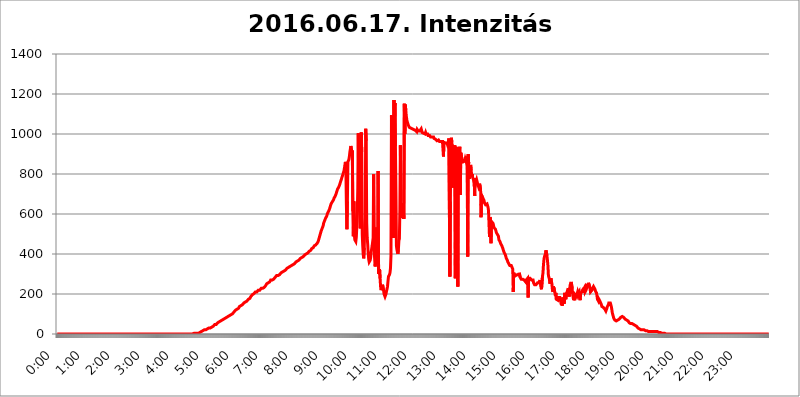
| Category | 2016.06.17. Intenzitás [W/m^2] |
|---|---|
| 0.0 | 0 |
| 0.0006944444444444445 | 0 |
| 0.001388888888888889 | 0 |
| 0.0020833333333333333 | 0 |
| 0.002777777777777778 | 0 |
| 0.003472222222222222 | 0 |
| 0.004166666666666667 | 0 |
| 0.004861111111111111 | 0 |
| 0.005555555555555556 | 0 |
| 0.0062499999999999995 | 0 |
| 0.006944444444444444 | 0 |
| 0.007638888888888889 | 0 |
| 0.008333333333333333 | 0 |
| 0.009027777777777779 | 0 |
| 0.009722222222222222 | 0 |
| 0.010416666666666666 | 0 |
| 0.011111111111111112 | 0 |
| 0.011805555555555555 | 0 |
| 0.012499999999999999 | 0 |
| 0.013194444444444444 | 0 |
| 0.013888888888888888 | 0 |
| 0.014583333333333332 | 0 |
| 0.015277777777777777 | 0 |
| 0.015972222222222224 | 0 |
| 0.016666666666666666 | 0 |
| 0.017361111111111112 | 0 |
| 0.018055555555555557 | 0 |
| 0.01875 | 0 |
| 0.019444444444444445 | 0 |
| 0.02013888888888889 | 0 |
| 0.020833333333333332 | 0 |
| 0.02152777777777778 | 0 |
| 0.022222222222222223 | 0 |
| 0.02291666666666667 | 0 |
| 0.02361111111111111 | 0 |
| 0.024305555555555556 | 0 |
| 0.024999999999999998 | 0 |
| 0.025694444444444447 | 0 |
| 0.02638888888888889 | 0 |
| 0.027083333333333334 | 0 |
| 0.027777777777777776 | 0 |
| 0.02847222222222222 | 0 |
| 0.029166666666666664 | 0 |
| 0.029861111111111113 | 0 |
| 0.030555555555555555 | 0 |
| 0.03125 | 0 |
| 0.03194444444444445 | 0 |
| 0.03263888888888889 | 0 |
| 0.03333333333333333 | 0 |
| 0.034027777777777775 | 0 |
| 0.034722222222222224 | 0 |
| 0.035416666666666666 | 0 |
| 0.036111111111111115 | 0 |
| 0.03680555555555556 | 0 |
| 0.0375 | 0 |
| 0.03819444444444444 | 0 |
| 0.03888888888888889 | 0 |
| 0.03958333333333333 | 0 |
| 0.04027777777777778 | 0 |
| 0.04097222222222222 | 0 |
| 0.041666666666666664 | 0 |
| 0.042361111111111106 | 0 |
| 0.04305555555555556 | 0 |
| 0.043750000000000004 | 0 |
| 0.044444444444444446 | 0 |
| 0.04513888888888889 | 0 |
| 0.04583333333333334 | 0 |
| 0.04652777777777778 | 0 |
| 0.04722222222222222 | 0 |
| 0.04791666666666666 | 0 |
| 0.04861111111111111 | 0 |
| 0.049305555555555554 | 0 |
| 0.049999999999999996 | 0 |
| 0.05069444444444445 | 0 |
| 0.051388888888888894 | 0 |
| 0.052083333333333336 | 0 |
| 0.05277777777777778 | 0 |
| 0.05347222222222222 | 0 |
| 0.05416666666666667 | 0 |
| 0.05486111111111111 | 0 |
| 0.05555555555555555 | 0 |
| 0.05625 | 0 |
| 0.05694444444444444 | 0 |
| 0.057638888888888885 | 0 |
| 0.05833333333333333 | 0 |
| 0.05902777777777778 | 0 |
| 0.059722222222222225 | 0 |
| 0.06041666666666667 | 0 |
| 0.061111111111111116 | 0 |
| 0.06180555555555556 | 0 |
| 0.0625 | 0 |
| 0.06319444444444444 | 0 |
| 0.06388888888888888 | 0 |
| 0.06458333333333334 | 0 |
| 0.06527777777777778 | 0 |
| 0.06597222222222222 | 0 |
| 0.06666666666666667 | 0 |
| 0.06736111111111111 | 0 |
| 0.06805555555555555 | 0 |
| 0.06874999999999999 | 0 |
| 0.06944444444444443 | 0 |
| 0.07013888888888889 | 0 |
| 0.07083333333333333 | 0 |
| 0.07152777777777779 | 0 |
| 0.07222222222222223 | 0 |
| 0.07291666666666667 | 0 |
| 0.07361111111111111 | 0 |
| 0.07430555555555556 | 0 |
| 0.075 | 0 |
| 0.07569444444444444 | 0 |
| 0.0763888888888889 | 0 |
| 0.07708333333333334 | 0 |
| 0.07777777777777778 | 0 |
| 0.07847222222222222 | 0 |
| 0.07916666666666666 | 0 |
| 0.0798611111111111 | 0 |
| 0.08055555555555556 | 0 |
| 0.08125 | 0 |
| 0.08194444444444444 | 0 |
| 0.08263888888888889 | 0 |
| 0.08333333333333333 | 0 |
| 0.08402777777777777 | 0 |
| 0.08472222222222221 | 0 |
| 0.08541666666666665 | 0 |
| 0.08611111111111112 | 0 |
| 0.08680555555555557 | 0 |
| 0.08750000000000001 | 0 |
| 0.08819444444444445 | 0 |
| 0.08888888888888889 | 0 |
| 0.08958333333333333 | 0 |
| 0.09027777777777778 | 0 |
| 0.09097222222222222 | 0 |
| 0.09166666666666667 | 0 |
| 0.09236111111111112 | 0 |
| 0.09305555555555556 | 0 |
| 0.09375 | 0 |
| 0.09444444444444444 | 0 |
| 0.09513888888888888 | 0 |
| 0.09583333333333333 | 0 |
| 0.09652777777777777 | 0 |
| 0.09722222222222222 | 0 |
| 0.09791666666666667 | 0 |
| 0.09861111111111111 | 0 |
| 0.09930555555555555 | 0 |
| 0.09999999999999999 | 0 |
| 0.10069444444444443 | 0 |
| 0.1013888888888889 | 0 |
| 0.10208333333333335 | 0 |
| 0.10277777777777779 | 0 |
| 0.10347222222222223 | 0 |
| 0.10416666666666667 | 0 |
| 0.10486111111111111 | 0 |
| 0.10555555555555556 | 0 |
| 0.10625 | 0 |
| 0.10694444444444444 | 0 |
| 0.1076388888888889 | 0 |
| 0.10833333333333334 | 0 |
| 0.10902777777777778 | 0 |
| 0.10972222222222222 | 0 |
| 0.1111111111111111 | 0 |
| 0.11180555555555556 | 0 |
| 0.11180555555555556 | 0 |
| 0.1125 | 0 |
| 0.11319444444444444 | 0 |
| 0.11388888888888889 | 0 |
| 0.11458333333333333 | 0 |
| 0.11527777777777777 | 0 |
| 0.11597222222222221 | 0 |
| 0.11666666666666665 | 0 |
| 0.1173611111111111 | 0 |
| 0.11805555555555557 | 0 |
| 0.11944444444444445 | 0 |
| 0.12013888888888889 | 0 |
| 0.12083333333333333 | 0 |
| 0.12152777777777778 | 0 |
| 0.12222222222222223 | 0 |
| 0.12291666666666667 | 0 |
| 0.12291666666666667 | 0 |
| 0.12361111111111112 | 0 |
| 0.12430555555555556 | 0 |
| 0.125 | 0 |
| 0.12569444444444444 | 0 |
| 0.12638888888888888 | 0 |
| 0.12708333333333333 | 0 |
| 0.16875 | 0 |
| 0.12847222222222224 | 0 |
| 0.12916666666666668 | 0 |
| 0.12986111111111112 | 0 |
| 0.13055555555555556 | 0 |
| 0.13125 | 0 |
| 0.13194444444444445 | 0 |
| 0.1326388888888889 | 0 |
| 0.13333333333333333 | 0 |
| 0.13402777777777777 | 0 |
| 0.13402777777777777 | 0 |
| 0.13472222222222222 | 0 |
| 0.13541666666666666 | 0 |
| 0.1361111111111111 | 0 |
| 0.13749999999999998 | 0 |
| 0.13819444444444443 | 0 |
| 0.1388888888888889 | 0 |
| 0.13958333333333334 | 0 |
| 0.14027777777777778 | 0 |
| 0.14097222222222222 | 0 |
| 0.14166666666666666 | 0 |
| 0.1423611111111111 | 0 |
| 0.14305555555555557 | 0 |
| 0.14375000000000002 | 0 |
| 0.14444444444444446 | 0 |
| 0.1451388888888889 | 0 |
| 0.1451388888888889 | 0 |
| 0.14652777777777778 | 0 |
| 0.14722222222222223 | 0 |
| 0.14791666666666667 | 0 |
| 0.1486111111111111 | 0 |
| 0.14930555555555555 | 0 |
| 0.15 | 0 |
| 0.15069444444444444 | 0 |
| 0.15138888888888888 | 0 |
| 0.15208333333333332 | 0 |
| 0.15277777777777776 | 0 |
| 0.15347222222222223 | 0 |
| 0.15416666666666667 | 0 |
| 0.15486111111111112 | 0 |
| 0.15555555555555556 | 0 |
| 0.15625 | 0 |
| 0.15694444444444444 | 0 |
| 0.15763888888888888 | 0 |
| 0.15833333333333333 | 0 |
| 0.15902777777777777 | 0 |
| 0.15972222222222224 | 0 |
| 0.16041666666666668 | 0 |
| 0.16111111111111112 | 0 |
| 0.16180555555555556 | 0 |
| 0.1625 | 0 |
| 0.16319444444444445 | 0 |
| 0.1638888888888889 | 0 |
| 0.16458333333333333 | 0 |
| 0.16527777777777777 | 0 |
| 0.16597222222222222 | 0 |
| 0.16666666666666666 | 0 |
| 0.1673611111111111 | 0 |
| 0.16805555555555554 | 0 |
| 0.16874999999999998 | 0 |
| 0.16944444444444443 | 0 |
| 0.17013888888888887 | 0 |
| 0.1708333333333333 | 0 |
| 0.17152777777777775 | 0 |
| 0.17222222222222225 | 0 |
| 0.1729166666666667 | 0 |
| 0.17361111111111113 | 0 |
| 0.17430555555555557 | 0 |
| 0.17500000000000002 | 0 |
| 0.17569444444444446 | 0 |
| 0.1763888888888889 | 0 |
| 0.17708333333333334 | 0 |
| 0.17777777777777778 | 0 |
| 0.17847222222222223 | 0 |
| 0.17916666666666667 | 0 |
| 0.1798611111111111 | 0 |
| 0.18055555555555555 | 0 |
| 0.18125 | 0 |
| 0.18194444444444444 | 0 |
| 0.1826388888888889 | 0 |
| 0.18333333333333335 | 0 |
| 0.1840277777777778 | 0 |
| 0.18472222222222223 | 0 |
| 0.18541666666666667 | 0 |
| 0.18611111111111112 | 0 |
| 0.18680555555555556 | 0 |
| 0.1875 | 0 |
| 0.18819444444444444 | 0 |
| 0.18888888888888888 | 0 |
| 0.18958333333333333 | 0 |
| 0.19027777777777777 | 0 |
| 0.1909722222222222 | 3.525 |
| 0.19166666666666665 | 3.525 |
| 0.19236111111111112 | 3.525 |
| 0.19305555555555554 | 3.525 |
| 0.19375 | 3.525 |
| 0.19444444444444445 | 3.525 |
| 0.1951388888888889 | 3.525 |
| 0.19583333333333333 | 3.525 |
| 0.19652777777777777 | 3.525 |
| 0.19722222222222222 | 7.887 |
| 0.19791666666666666 | 3.525 |
| 0.1986111111111111 | 7.887 |
| 0.19930555555555554 | 7.887 |
| 0.19999999999999998 | 7.887 |
| 0.20069444444444443 | 12.257 |
| 0.20138888888888887 | 12.257 |
| 0.2020833333333333 | 12.257 |
| 0.2027777777777778 | 12.257 |
| 0.2034722222222222 | 12.257 |
| 0.2041666666666667 | 16.636 |
| 0.20486111111111113 | 16.636 |
| 0.20555555555555557 | 16.636 |
| 0.20625000000000002 | 21.024 |
| 0.20694444444444446 | 21.024 |
| 0.2076388888888889 | 21.024 |
| 0.20833333333333334 | 21.024 |
| 0.20902777777777778 | 25.419 |
| 0.20972222222222223 | 25.419 |
| 0.21041666666666667 | 25.419 |
| 0.2111111111111111 | 25.419 |
| 0.21180555555555555 | 29.823 |
| 0.2125 | 29.823 |
| 0.21319444444444444 | 29.823 |
| 0.2138888888888889 | 29.823 |
| 0.21458333333333335 | 29.823 |
| 0.2152777777777778 | 34.234 |
| 0.21597222222222223 | 34.234 |
| 0.21666666666666667 | 34.234 |
| 0.21736111111111112 | 38.653 |
| 0.21805555555555556 | 38.653 |
| 0.21875 | 38.653 |
| 0.21944444444444444 | 43.079 |
| 0.22013888888888888 | 43.079 |
| 0.22083333333333333 | 47.511 |
| 0.22152777777777777 | 47.511 |
| 0.2222222222222222 | 47.511 |
| 0.22291666666666665 | 47.511 |
| 0.2236111111111111 | 51.951 |
| 0.22430555555555556 | 51.951 |
| 0.225 | 56.398 |
| 0.22569444444444445 | 56.398 |
| 0.2263888888888889 | 56.398 |
| 0.22708333333333333 | 60.85 |
| 0.22777777777777777 | 60.85 |
| 0.22847222222222222 | 60.85 |
| 0.22916666666666666 | 65.31 |
| 0.2298611111111111 | 65.31 |
| 0.23055555555555554 | 65.31 |
| 0.23124999999999998 | 69.775 |
| 0.23194444444444443 | 69.775 |
| 0.23263888888888887 | 74.246 |
| 0.2333333333333333 | 74.246 |
| 0.2340277777777778 | 74.246 |
| 0.2347222222222222 | 74.246 |
| 0.2354166666666667 | 78.722 |
| 0.23611111111111113 | 78.722 |
| 0.23680555555555557 | 78.722 |
| 0.23750000000000002 | 83.205 |
| 0.23819444444444446 | 83.205 |
| 0.2388888888888889 | 83.205 |
| 0.23958333333333334 | 87.692 |
| 0.24027777777777778 | 92.184 |
| 0.24097222222222223 | 92.184 |
| 0.24166666666666667 | 92.184 |
| 0.2423611111111111 | 92.184 |
| 0.24305555555555555 | 96.682 |
| 0.24375 | 96.682 |
| 0.24444444444444446 | 101.184 |
| 0.24513888888888888 | 101.184 |
| 0.24583333333333335 | 101.184 |
| 0.2465277777777778 | 105.69 |
| 0.24722222222222223 | 105.69 |
| 0.24791666666666667 | 110.201 |
| 0.24861111111111112 | 110.201 |
| 0.24930555555555556 | 114.716 |
| 0.25 | 119.235 |
| 0.25069444444444444 | 119.235 |
| 0.2513888888888889 | 119.235 |
| 0.2520833333333333 | 123.758 |
| 0.25277777777777777 | 128.284 |
| 0.2534722222222222 | 128.284 |
| 0.25416666666666665 | 128.284 |
| 0.2548611111111111 | 132.814 |
| 0.2555555555555556 | 137.347 |
| 0.25625000000000003 | 137.347 |
| 0.2569444444444445 | 141.884 |
| 0.2576388888888889 | 141.884 |
| 0.25833333333333336 | 146.423 |
| 0.2590277777777778 | 146.423 |
| 0.25972222222222224 | 146.423 |
| 0.2604166666666667 | 150.964 |
| 0.2611111111111111 | 150.964 |
| 0.26180555555555557 | 155.509 |
| 0.2625 | 155.509 |
| 0.26319444444444445 | 155.509 |
| 0.2638888888888889 | 160.056 |
| 0.26458333333333334 | 164.605 |
| 0.2652777777777778 | 164.605 |
| 0.2659722222222222 | 164.605 |
| 0.26666666666666666 | 169.156 |
| 0.2673611111111111 | 169.156 |
| 0.26805555555555555 | 173.709 |
| 0.26875 | 173.709 |
| 0.26944444444444443 | 178.264 |
| 0.2701388888888889 | 178.264 |
| 0.2708333333333333 | 182.82 |
| 0.27152777777777776 | 187.378 |
| 0.2722222222222222 | 187.378 |
| 0.27291666666666664 | 191.937 |
| 0.2736111111111111 | 196.497 |
| 0.2743055555555555 | 196.497 |
| 0.27499999999999997 | 201.058 |
| 0.27569444444444446 | 201.058 |
| 0.27638888888888885 | 205.62 |
| 0.27708333333333335 | 205.62 |
| 0.2777777777777778 | 210.182 |
| 0.27847222222222223 | 210.182 |
| 0.2791666666666667 | 210.182 |
| 0.2798611111111111 | 210.182 |
| 0.28055555555555556 | 214.746 |
| 0.28125 | 214.746 |
| 0.28194444444444444 | 219.309 |
| 0.2826388888888889 | 219.309 |
| 0.2833333333333333 | 219.309 |
| 0.28402777777777777 | 219.309 |
| 0.2847222222222222 | 223.873 |
| 0.28541666666666665 | 223.873 |
| 0.28611111111111115 | 228.436 |
| 0.28680555555555554 | 228.436 |
| 0.28750000000000003 | 228.436 |
| 0.2881944444444445 | 228.436 |
| 0.2888888888888889 | 233 |
| 0.28958333333333336 | 233 |
| 0.2902777777777778 | 233 |
| 0.29097222222222224 | 237.564 |
| 0.2916666666666667 | 237.564 |
| 0.2923611111111111 | 242.127 |
| 0.29305555555555557 | 246.689 |
| 0.29375 | 251.251 |
| 0.29444444444444445 | 251.251 |
| 0.2951388888888889 | 251.251 |
| 0.29583333333333334 | 255.813 |
| 0.2965277777777778 | 255.813 |
| 0.2972222222222222 | 260.373 |
| 0.29791666666666666 | 260.373 |
| 0.2986111111111111 | 264.932 |
| 0.29930555555555555 | 269.49 |
| 0.3 | 269.49 |
| 0.30069444444444443 | 269.49 |
| 0.3013888888888889 | 269.49 |
| 0.3020833333333333 | 274.047 |
| 0.30277777777777776 | 274.047 |
| 0.3034722222222222 | 274.047 |
| 0.30416666666666664 | 278.603 |
| 0.3048611111111111 | 278.603 |
| 0.3055555555555555 | 283.156 |
| 0.30624999999999997 | 283.156 |
| 0.3069444444444444 | 287.709 |
| 0.3076388888888889 | 292.259 |
| 0.30833333333333335 | 292.259 |
| 0.3090277777777778 | 292.259 |
| 0.30972222222222223 | 292.259 |
| 0.3104166666666667 | 292.259 |
| 0.3111111111111111 | 296.808 |
| 0.31180555555555556 | 296.808 |
| 0.3125 | 296.808 |
| 0.31319444444444444 | 301.354 |
| 0.3138888888888889 | 305.898 |
| 0.3145833333333333 | 305.898 |
| 0.31527777777777777 | 305.898 |
| 0.3159722222222222 | 310.44 |
| 0.31666666666666665 | 310.44 |
| 0.31736111111111115 | 314.98 |
| 0.31805555555555554 | 314.98 |
| 0.31875000000000003 | 314.98 |
| 0.3194444444444445 | 319.517 |
| 0.3201388888888889 | 319.517 |
| 0.32083333333333336 | 324.052 |
| 0.3215277777777778 | 324.052 |
| 0.32222222222222224 | 328.584 |
| 0.3229166666666667 | 328.584 |
| 0.3236111111111111 | 328.584 |
| 0.32430555555555557 | 333.113 |
| 0.325 | 333.113 |
| 0.32569444444444445 | 333.113 |
| 0.3263888888888889 | 337.639 |
| 0.32708333333333334 | 342.162 |
| 0.3277777777777778 | 342.162 |
| 0.3284722222222222 | 342.162 |
| 0.32916666666666666 | 346.682 |
| 0.3298611111111111 | 346.682 |
| 0.33055555555555555 | 346.682 |
| 0.33125 | 346.682 |
| 0.33194444444444443 | 351.198 |
| 0.3326388888888889 | 351.198 |
| 0.3333333333333333 | 351.198 |
| 0.3340277777777778 | 355.712 |
| 0.3347222222222222 | 360.221 |
| 0.3354166666666667 | 360.221 |
| 0.3361111111111111 | 360.221 |
| 0.3368055555555556 | 364.728 |
| 0.33749999999999997 | 369.23 |
| 0.33819444444444446 | 369.23 |
| 0.33888888888888885 | 369.23 |
| 0.33958333333333335 | 373.729 |
| 0.34027777777777773 | 373.729 |
| 0.34097222222222223 | 378.224 |
| 0.3416666666666666 | 378.224 |
| 0.3423611111111111 | 378.224 |
| 0.3430555555555555 | 382.715 |
| 0.34375 | 387.202 |
| 0.3444444444444445 | 387.202 |
| 0.3451388888888889 | 387.202 |
| 0.3458333333333334 | 391.685 |
| 0.34652777777777777 | 391.685 |
| 0.34722222222222227 | 396.164 |
| 0.34791666666666665 | 396.164 |
| 0.34861111111111115 | 400.638 |
| 0.34930555555555554 | 400.638 |
| 0.35000000000000003 | 405.108 |
| 0.3506944444444444 | 405.108 |
| 0.3513888888888889 | 405.108 |
| 0.3520833333333333 | 409.574 |
| 0.3527777777777778 | 409.574 |
| 0.3534722222222222 | 414.035 |
| 0.3541666666666667 | 414.035 |
| 0.3548611111111111 | 418.492 |
| 0.35555555555555557 | 418.492 |
| 0.35625 | 422.943 |
| 0.35694444444444445 | 427.39 |
| 0.3576388888888889 | 427.39 |
| 0.35833333333333334 | 431.833 |
| 0.3590277777777778 | 431.833 |
| 0.3597222222222222 | 436.27 |
| 0.36041666666666666 | 440.702 |
| 0.3611111111111111 | 440.702 |
| 0.36180555555555555 | 445.129 |
| 0.3625 | 445.129 |
| 0.36319444444444443 | 449.551 |
| 0.3638888888888889 | 449.551 |
| 0.3645833333333333 | 453.968 |
| 0.3652777777777778 | 458.38 |
| 0.3659722222222222 | 462.786 |
| 0.3666666666666667 | 471.582 |
| 0.3673611111111111 | 480.356 |
| 0.3680555555555556 | 489.108 |
| 0.36874999999999997 | 497.836 |
| 0.36944444444444446 | 502.192 |
| 0.37013888888888885 | 515.223 |
| 0.37083333333333335 | 519.555 |
| 0.37152777777777773 | 528.2 |
| 0.37222222222222223 | 532.513 |
| 0.3729166666666666 | 541.121 |
| 0.3736111111111111 | 553.986 |
| 0.3743055555555555 | 558.261 |
| 0.375 | 566.793 |
| 0.3756944444444445 | 571.049 |
| 0.3763888888888889 | 579.542 |
| 0.3770833333333334 | 583.779 |
| 0.37777777777777777 | 588.009 |
| 0.37847222222222227 | 596.45 |
| 0.37916666666666665 | 604.864 |
| 0.37986111111111115 | 604.864 |
| 0.38055555555555554 | 613.252 |
| 0.38125000000000003 | 617.436 |
| 0.3819444444444444 | 625.784 |
| 0.3826388888888889 | 634.105 |
| 0.3833333333333333 | 642.4 |
| 0.3840277777777778 | 650.667 |
| 0.3847222222222222 | 654.791 |
| 0.3854166666666667 | 654.791 |
| 0.3861111111111111 | 663.019 |
| 0.38680555555555557 | 667.123 |
| 0.3875 | 671.22 |
| 0.38819444444444445 | 679.395 |
| 0.3888888888888889 | 683.473 |
| 0.38958333333333334 | 687.544 |
| 0.3902777777777778 | 691.608 |
| 0.3909722222222222 | 699.717 |
| 0.39166666666666666 | 707.8 |
| 0.3923611111111111 | 715.858 |
| 0.39305555555555555 | 723.889 |
| 0.39375 | 723.889 |
| 0.39444444444444443 | 731.896 |
| 0.3951388888888889 | 735.89 |
| 0.3958333333333333 | 743.859 |
| 0.3965277777777778 | 751.803 |
| 0.3972222222222222 | 759.723 |
| 0.3979166666666667 | 767.62 |
| 0.3986111111111111 | 775.492 |
| 0.3993055555555556 | 783.342 |
| 0.39999999999999997 | 787.258 |
| 0.40069444444444446 | 798.974 |
| 0.40138888888888885 | 806.757 |
| 0.40208333333333335 | 814.519 |
| 0.40277777777777773 | 829.981 |
| 0.40347222222222223 | 845.365 |
| 0.4041666666666666 | 860.676 |
| 0.4048611111111111 | 818.392 |
| 0.4055555555555555 | 642.4 |
| 0.40625 | 523.88 |
| 0.4069444444444445 | 663.019 |
| 0.4076388888888889 | 860.676 |
| 0.4083333333333334 | 864.493 |
| 0.40902777777777777 | 872.114 |
| 0.40972222222222227 | 887.309 |
| 0.41041666666666665 | 909.996 |
| 0.41111111111111115 | 925.06 |
| 0.41180555555555554 | 940.082 |
| 0.41250000000000003 | 940.082 |
| 0.4131944444444444 | 909.996 |
| 0.4138888888888889 | 917.534 |
| 0.4145833333333333 | 613.252 |
| 0.4152777777777778 | 489.108 |
| 0.4159722222222222 | 663.019 |
| 0.4166666666666667 | 497.836 |
| 0.4173611111111111 | 471.582 |
| 0.41805555555555557 | 467.187 |
| 0.41875 | 462.786 |
| 0.41944444444444445 | 484.735 |
| 0.4201388888888889 | 536.82 |
| 0.42083333333333334 | 609.062 |
| 0.4215277777777778 | 731.896 |
| 0.4222222222222222 | 1003.65 |
| 0.42291666666666666 | 679.395 |
| 0.4236111111111111 | 629.948 |
| 0.42430555555555555 | 596.45 |
| 0.425 | 528.2 |
| 0.42569444444444443 | 528.2 |
| 0.4263888888888889 | 1007.383 |
| 0.4270833333333333 | 909.996 |
| 0.4277777777777778 | 497.836 |
| 0.4284722222222222 | 440.702 |
| 0.4291666666666667 | 396.164 |
| 0.4298611111111111 | 378.224 |
| 0.4305555555555556 | 431.833 |
| 0.43124999999999997 | 545.416 |
| 0.43194444444444446 | 583.779 |
| 0.43263888888888885 | 1026.06 |
| 0.43333333333333335 | 966.295 |
| 0.43402777777777773 | 553.986 |
| 0.43472222222222223 | 480.356 |
| 0.4354166666666666 | 449.551 |
| 0.4361111111111111 | 405.108 |
| 0.4368055555555555 | 373.729 |
| 0.4375 | 360.221 |
| 0.4381944444444445 | 360.221 |
| 0.4388888888888889 | 369.23 |
| 0.4395833333333334 | 382.715 |
| 0.44027777777777777 | 409.574 |
| 0.44097222222222227 | 414.035 |
| 0.44166666666666665 | 440.702 |
| 0.44236111111111115 | 440.702 |
| 0.44305555555555554 | 480.356 |
| 0.44375000000000003 | 798.974 |
| 0.4444444444444444 | 422.943 |
| 0.4451388888888889 | 378.224 |
| 0.4458333333333333 | 337.639 |
| 0.4465277777777778 | 342.162 |
| 0.4472222222222222 | 382.715 |
| 0.4479166666666667 | 532.513 |
| 0.4486111111111111 | 382.715 |
| 0.44930555555555557 | 418.492 |
| 0.45 | 814.519 |
| 0.45069444444444445 | 301.354 |
| 0.4513888888888889 | 305.898 |
| 0.45208333333333334 | 324.052 |
| 0.4527777777777778 | 278.603 |
| 0.4534722222222222 | 237.564 |
| 0.45416666666666666 | 219.309 |
| 0.4548611111111111 | 219.309 |
| 0.45555555555555555 | 233 |
| 0.45625 | 246.689 |
| 0.45694444444444443 | 242.127 |
| 0.4576388888888889 | 219.309 |
| 0.4583333333333333 | 201.058 |
| 0.4590277777777778 | 196.497 |
| 0.4597222222222222 | 187.378 |
| 0.4604166666666667 | 187.378 |
| 0.4611111111111111 | 201.058 |
| 0.4618055555555556 | 214.746 |
| 0.46249999999999997 | 223.873 |
| 0.46319444444444446 | 237.564 |
| 0.46388888888888885 | 264.932 |
| 0.46458333333333335 | 287.709 |
| 0.46527777777777773 | 287.709 |
| 0.46597222222222223 | 296.808 |
| 0.4666666666666666 | 305.898 |
| 0.4673611111111111 | 328.584 |
| 0.4680555555555555 | 391.685 |
| 0.46875 | 1093.653 |
| 0.4694444444444445 | 545.416 |
| 0.4701388888888889 | 480.356 |
| 0.4708333333333334 | 510.885 |
| 0.47152777777777777 | 480.356 |
| 0.47222222222222227 | 1170.358 |
| 0.47291666666666665 | 1044.762 |
| 0.47361111111111115 | 1154.814 |
| 0.47430555555555554 | 940.082 |
| 0.47500000000000003 | 707.8 |
| 0.4756944444444444 | 440.702 |
| 0.4763888888888889 | 422.943 |
| 0.4770833333333333 | 409.574 |
| 0.4777777777777778 | 400.638 |
| 0.4784722222222222 | 422.943 |
| 0.4791666666666667 | 467.187 |
| 0.4798611111111111 | 475.972 |
| 0.48055555555555557 | 621.613 |
| 0.48125 | 943.832 |
| 0.48194444444444445 | 667.123 |
| 0.4826388888888889 | 579.542 |
| 0.48333333333333334 | 613.252 |
| 0.4840277777777778 | 654.791 |
| 0.4847222222222222 | 592.233 |
| 0.48541666666666666 | 617.436 |
| 0.4861111111111111 | 575.299 |
| 0.48680555555555555 | 1150.946 |
| 0.4875 | 999.916 |
| 0.48819444444444443 | 1147.086 |
| 0.4888888888888889 | 1116.426 |
| 0.4895833333333333 | 1089.873 |
| 0.4902777777777778 | 1071.027 |
| 0.4909722222222222 | 1059.756 |
| 0.4916666666666667 | 1052.255 |
| 0.4923611111111111 | 1044.762 |
| 0.4930555555555556 | 1044.762 |
| 0.49374999999999997 | 1033.537 |
| 0.49444444444444446 | 1033.537 |
| 0.49513888888888885 | 1033.537 |
| 0.49583333333333335 | 1029.798 |
| 0.49652777777777773 | 1029.798 |
| 0.49722222222222223 | 1029.798 |
| 0.4979166666666666 | 1026.06 |
| 0.4986111111111111 | 1022.323 |
| 0.4993055555555555 | 1022.323 |
| 0.5 | 1022.323 |
| 0.5006944444444444 | 1022.323 |
| 0.5013888888888889 | 1018.587 |
| 0.5020833333333333 | 1018.587 |
| 0.5027777777777778 | 1018.587 |
| 0.5034722222222222 | 1014.852 |
| 0.5041666666666667 | 1011.118 |
| 0.5048611111111111 | 1022.323 |
| 0.5055555555555555 | 1018.587 |
| 0.50625 | 1014.852 |
| 0.5069444444444444 | 1014.852 |
| 0.5076388888888889 | 1014.852 |
| 0.5083333333333333 | 1014.852 |
| 0.5090277777777777 | 1014.852 |
| 0.5097222222222222 | 1018.587 |
| 0.5104166666666666 | 1026.06 |
| 0.5111111111111112 | 1022.323 |
| 0.5118055555555555 | 1007.383 |
| 0.5125000000000001 | 1011.118 |
| 0.5131944444444444 | 1003.65 |
| 0.513888888888889 | 1003.65 |
| 0.5145833333333333 | 999.916 |
| 0.5152777777777778 | 1007.383 |
| 0.5159722222222222 | 999.916 |
| 0.5166666666666667 | 1007.383 |
| 0.517361111111111 | 999.916 |
| 0.5180555555555556 | 999.916 |
| 0.5187499999999999 | 999.916 |
| 0.5194444444444445 | 999.916 |
| 0.5201388888888888 | 992.448 |
| 0.5208333333333334 | 992.448 |
| 0.5215277777777778 | 996.182 |
| 0.5222222222222223 | 992.448 |
| 0.5229166666666667 | 988.714 |
| 0.5236111111111111 | 984.98 |
| 0.5243055555555556 | 981.244 |
| 0.525 | 984.98 |
| 0.5256944444444445 | 984.98 |
| 0.5263888888888889 | 981.244 |
| 0.5270833333333333 | 984.98 |
| 0.5277777777777778 | 984.98 |
| 0.5284722222222222 | 977.508 |
| 0.5291666666666667 | 977.508 |
| 0.5298611111111111 | 973.772 |
| 0.5305555555555556 | 973.772 |
| 0.53125 | 973.772 |
| 0.5319444444444444 | 970.034 |
| 0.5326388888888889 | 966.295 |
| 0.5333333333333333 | 970.034 |
| 0.5340277777777778 | 970.034 |
| 0.5347222222222222 | 970.034 |
| 0.5354166666666667 | 966.295 |
| 0.5361111111111111 | 962.555 |
| 0.5368055555555555 | 962.555 |
| 0.5375 | 966.295 |
| 0.5381944444444444 | 962.555 |
| 0.5388888888888889 | 966.295 |
| 0.5395833333333333 | 962.555 |
| 0.5402777777777777 | 962.555 |
| 0.5409722222222222 | 962.555 |
| 0.5416666666666666 | 887.309 |
| 0.5423611111111112 | 958.814 |
| 0.5430555555555555 | 958.814 |
| 0.5437500000000001 | 955.071 |
| 0.5444444444444444 | 955.071 |
| 0.545138888888889 | 958.814 |
| 0.5458333333333333 | 955.071 |
| 0.5465277777777778 | 955.071 |
| 0.5472222222222222 | 947.58 |
| 0.5479166666666667 | 951.327 |
| 0.548611111111111 | 962.555 |
| 0.5493055555555556 | 977.508 |
| 0.5499999999999999 | 977.508 |
| 0.5506944444444445 | 287.709 |
| 0.5513888888888888 | 663.019 |
| 0.5520833333333334 | 970.034 |
| 0.5527777777777778 | 981.244 |
| 0.5534722222222223 | 958.814 |
| 0.5541666666666667 | 731.896 |
| 0.5548611111111111 | 940.082 |
| 0.5555555555555556 | 936.33 |
| 0.55625 | 932.576 |
| 0.5569444444444445 | 936.33 |
| 0.5576388888888889 | 943.832 |
| 0.5583333333333333 | 278.603 |
| 0.5590277777777778 | 936.33 |
| 0.5597222222222222 | 427.39 |
| 0.5604166666666667 | 296.808 |
| 0.5611111111111111 | 932.576 |
| 0.5618055555555556 | 237.564 |
| 0.5625 | 917.534 |
| 0.5631944444444444 | 902.447 |
| 0.5638888888888889 | 909.996 |
| 0.5645833333333333 | 936.33 |
| 0.5652777777777778 | 695.666 |
| 0.5659722222222222 | 906.223 |
| 0.5666666666666667 | 906.223 |
| 0.5673611111111111 | 879.719 |
| 0.5680555555555555 | 872.114 |
| 0.56875 | 868.305 |
| 0.5694444444444444 | 860.676 |
| 0.5701388888888889 | 856.855 |
| 0.5708333333333333 | 856.855 |
| 0.5715277777777777 | 864.493 |
| 0.5722222222222222 | 875.918 |
| 0.5729166666666666 | 868.305 |
| 0.5736111111111112 | 860.676 |
| 0.5743055555555555 | 872.114 |
| 0.5750000000000001 | 887.309 |
| 0.5756944444444444 | 387.202 |
| 0.576388888888889 | 898.668 |
| 0.5770833333333333 | 853.029 |
| 0.5777777777777778 | 775.492 |
| 0.5784722222222222 | 826.123 |
| 0.5791666666666667 | 829.981 |
| 0.579861111111111 | 845.365 |
| 0.5805555555555556 | 822.26 |
| 0.5812499999999999 | 787.258 |
| 0.5819444444444445 | 798.974 |
| 0.5826388888888888 | 783.342 |
| 0.5833333333333334 | 775.492 |
| 0.5840277777777778 | 767.62 |
| 0.5847222222222223 | 775.492 |
| 0.5854166666666667 | 691.608 |
| 0.5861111111111111 | 779.42 |
| 0.5868055555555556 | 783.342 |
| 0.5875 | 763.674 |
| 0.5881944444444445 | 771.559 |
| 0.5888888888888889 | 771.559 |
| 0.5895833333333333 | 751.803 |
| 0.5902777777777778 | 743.859 |
| 0.5909722222222222 | 735.89 |
| 0.5916666666666667 | 743.859 |
| 0.5923611111111111 | 751.803 |
| 0.5930555555555556 | 747.834 |
| 0.59375 | 723.889 |
| 0.5944444444444444 | 583.779 |
| 0.5951388888888889 | 695.666 |
| 0.5958333333333333 | 675.311 |
| 0.5965277777777778 | 683.473 |
| 0.5972222222222222 | 683.473 |
| 0.5979166666666667 | 679.395 |
| 0.5986111111111111 | 667.123 |
| 0.5993055555555555 | 654.791 |
| 0.6 | 650.667 |
| 0.6006944444444444 | 646.537 |
| 0.6013888888888889 | 646.537 |
| 0.6020833333333333 | 650.667 |
| 0.6027777777777777 | 650.667 |
| 0.6034722222222222 | 646.537 |
| 0.6041666666666666 | 634.105 |
| 0.6048611111111112 | 617.436 |
| 0.6055555555555555 | 613.252 |
| 0.6062500000000001 | 484.735 |
| 0.6069444444444444 | 583.779 |
| 0.607638888888889 | 575.299 |
| 0.6083333333333333 | 453.968 |
| 0.6090277777777778 | 562.53 |
| 0.6097222222222222 | 562.53 |
| 0.6104166666666667 | 562.53 |
| 0.611111111111111 | 553.986 |
| 0.6118055555555556 | 545.416 |
| 0.6124999999999999 | 532.513 |
| 0.6131944444444445 | 536.82 |
| 0.6138888888888888 | 528.2 |
| 0.6145833333333334 | 523.88 |
| 0.6152777777777778 | 515.223 |
| 0.6159722222222223 | 506.542 |
| 0.6166666666666667 | 502.192 |
| 0.6173611111111111 | 497.836 |
| 0.6180555555555556 | 493.475 |
| 0.61875 | 489.108 |
| 0.6194444444444445 | 471.582 |
| 0.6201388888888889 | 467.187 |
| 0.6208333333333333 | 462.786 |
| 0.6215277777777778 | 458.38 |
| 0.6222222222222222 | 449.551 |
| 0.6229166666666667 | 445.129 |
| 0.6236111111111111 | 440.702 |
| 0.6243055555555556 | 436.27 |
| 0.625 | 427.39 |
| 0.6256944444444444 | 418.492 |
| 0.6263888888888889 | 414.035 |
| 0.6270833333333333 | 405.108 |
| 0.6277777777777778 | 400.638 |
| 0.6284722222222222 | 396.164 |
| 0.6291666666666667 | 387.202 |
| 0.6298611111111111 | 378.224 |
| 0.6305555555555555 | 373.729 |
| 0.63125 | 369.23 |
| 0.6319444444444444 | 360.221 |
| 0.6326388888888889 | 355.712 |
| 0.6333333333333333 | 351.198 |
| 0.6340277777777777 | 346.682 |
| 0.6347222222222222 | 342.162 |
| 0.6354166666666666 | 337.639 |
| 0.6361111111111112 | 342.162 |
| 0.6368055555555555 | 342.162 |
| 0.6375000000000001 | 346.682 |
| 0.6381944444444444 | 342.162 |
| 0.638888888888889 | 324.052 |
| 0.6395833333333333 | 210.182 |
| 0.6402777777777778 | 305.898 |
| 0.6409722222222222 | 296.808 |
| 0.6416666666666667 | 292.259 |
| 0.642361111111111 | 292.259 |
| 0.6430555555555556 | 292.259 |
| 0.6437499999999999 | 296.808 |
| 0.6444444444444445 | 292.259 |
| 0.6451388888888888 | 296.808 |
| 0.6458333333333334 | 296.808 |
| 0.6465277777777778 | 292.259 |
| 0.6472222222222223 | 296.808 |
| 0.6479166666666667 | 305.898 |
| 0.6486111111111111 | 301.354 |
| 0.6493055555555556 | 283.156 |
| 0.65 | 278.603 |
| 0.6506944444444445 | 274.047 |
| 0.6513888888888889 | 274.047 |
| 0.6520833333333333 | 274.047 |
| 0.6527777777777778 | 274.047 |
| 0.6534722222222222 | 274.047 |
| 0.6541666666666667 | 274.047 |
| 0.6548611111111111 | 269.49 |
| 0.6555555555555556 | 274.047 |
| 0.65625 | 264.932 |
| 0.6569444444444444 | 260.373 |
| 0.6576388888888889 | 269.49 |
| 0.6583333333333333 | 269.49 |
| 0.6590277777777778 | 274.047 |
| 0.6597222222222222 | 278.603 |
| 0.6604166666666667 | 182.82 |
| 0.6611111111111111 | 278.603 |
| 0.6618055555555555 | 274.047 |
| 0.6625 | 278.603 |
| 0.6631944444444444 | 278.603 |
| 0.6638888888888889 | 278.603 |
| 0.6645833333333333 | 278.603 |
| 0.6652777777777777 | 269.49 |
| 0.6659722222222222 | 269.49 |
| 0.6666666666666666 | 269.49 |
| 0.6673611111111111 | 269.49 |
| 0.6680555555555556 | 255.813 |
| 0.6687500000000001 | 255.813 |
| 0.6694444444444444 | 246.689 |
| 0.6701388888888888 | 251.251 |
| 0.6708333333333334 | 251.251 |
| 0.6715277777777778 | 246.689 |
| 0.6722222222222222 | 251.251 |
| 0.6729166666666666 | 251.251 |
| 0.6736111111111112 | 255.813 |
| 0.6743055555555556 | 251.251 |
| 0.6749999999999999 | 251.251 |
| 0.6756944444444444 | 255.813 |
| 0.6763888888888889 | 260.373 |
| 0.6770833333333334 | 269.49 |
| 0.6777777777777777 | 269.49 |
| 0.6784722222222223 | 264.932 |
| 0.6791666666666667 | 223.873 |
| 0.6798611111111111 | 223.873 |
| 0.6805555555555555 | 287.709 |
| 0.68125 | 305.898 |
| 0.6819444444444445 | 346.682 |
| 0.6826388888888889 | 373.729 |
| 0.6833333333333332 | 387.202 |
| 0.6840277777777778 | 387.202 |
| 0.6847222222222222 | 400.638 |
| 0.6854166666666667 | 418.492 |
| 0.686111111111111 | 414.035 |
| 0.6868055555555556 | 391.685 |
| 0.6875 | 369.23 |
| 0.6881944444444444 | 342.162 |
| 0.688888888888889 | 292.259 |
| 0.6895833333333333 | 287.709 |
| 0.6902777777777778 | 274.047 |
| 0.6909722222222222 | 251.251 |
| 0.6916666666666668 | 264.932 |
| 0.6923611111111111 | 278.603 |
| 0.6930555555555555 | 264.932 |
| 0.69375 | 251.251 |
| 0.6944444444444445 | 223.873 |
| 0.6951388888888889 | 210.182 |
| 0.6958333333333333 | 237.564 |
| 0.6965277777777777 | 237.564 |
| 0.6972222222222223 | 223.873 |
| 0.6979166666666666 | 205.62 |
| 0.6986111111111111 | 191.937 |
| 0.6993055555555556 | 205.62 |
| 0.7000000000000001 | 173.709 |
| 0.7006944444444444 | 178.264 |
| 0.7013888888888888 | 169.156 |
| 0.7020833333333334 | 169.156 |
| 0.7027777777777778 | 182.82 |
| 0.7034722222222222 | 182.82 |
| 0.7041666666666666 | 187.378 |
| 0.7048611111111112 | 182.82 |
| 0.7055555555555556 | 169.156 |
| 0.7062499999999999 | 160.056 |
| 0.7069444444444444 | 146.423 |
| 0.7076388888888889 | 155.509 |
| 0.7083333333333334 | 141.884 |
| 0.7090277777777777 | 182.82 |
| 0.7097222222222223 | 173.709 |
| 0.7104166666666667 | 173.709 |
| 0.7111111111111111 | 150.964 |
| 0.7118055555555555 | 205.62 |
| 0.7125 | 196.497 |
| 0.7131944444444445 | 173.709 |
| 0.7138888888888889 | 173.709 |
| 0.7145833333333332 | 205.62 |
| 0.7152777777777778 | 205.62 |
| 0.7159722222222222 | 205.62 |
| 0.7166666666666667 | 228.436 |
| 0.717361111111111 | 228.436 |
| 0.7180555555555556 | 187.378 |
| 0.71875 | 228.436 |
| 0.7194444444444444 | 246.689 |
| 0.720138888888889 | 251.251 |
| 0.7208333333333333 | 260.373 |
| 0.7215277777777778 | 260.373 |
| 0.7222222222222222 | 228.436 |
| 0.7229166666666668 | 196.497 |
| 0.7236111111111111 | 182.82 |
| 0.7243055555555555 | 169.156 |
| 0.725 | 178.264 |
| 0.7256944444444445 | 169.156 |
| 0.7263888888888889 | 196.497 |
| 0.7270833333333333 | 196.497 |
| 0.7277777777777777 | 191.937 |
| 0.7284722222222223 | 187.378 |
| 0.7291666666666666 | 201.058 |
| 0.7298611111111111 | 210.182 |
| 0.7305555555555556 | 201.058 |
| 0.7312500000000001 | 201.058 |
| 0.7319444444444444 | 210.182 |
| 0.7326388888888888 | 178.264 |
| 0.7333333333333334 | 169.156 |
| 0.7340277777777778 | 201.058 |
| 0.7347222222222222 | 201.058 |
| 0.7354166666666666 | 205.62 |
| 0.7361111111111112 | 214.746 |
| 0.7368055555555556 | 205.62 |
| 0.7374999999999999 | 219.309 |
| 0.7381944444444444 | 219.309 |
| 0.7388888888888889 | 223.873 |
| 0.7395833333333334 | 233 |
| 0.7402777777777777 | 210.182 |
| 0.7409722222222223 | 210.182 |
| 0.7416666666666667 | 219.309 |
| 0.7423611111111111 | 228.436 |
| 0.7430555555555555 | 251.251 |
| 0.74375 | 246.689 |
| 0.7444444444444445 | 237.564 |
| 0.7451388888888889 | 255.813 |
| 0.7458333333333332 | 251.251 |
| 0.7465277777777778 | 251.251 |
| 0.7472222222222222 | 228.436 |
| 0.7479166666666667 | 210.182 |
| 0.748611111111111 | 210.182 |
| 0.7493055555555556 | 210.182 |
| 0.75 | 219.309 |
| 0.7506944444444444 | 228.436 |
| 0.751388888888889 | 223.873 |
| 0.7520833333333333 | 237.564 |
| 0.7527777777777778 | 242.127 |
| 0.7534722222222222 | 242.127 |
| 0.7541666666666668 | 223.873 |
| 0.7548611111111111 | 214.746 |
| 0.7555555555555555 | 219.309 |
| 0.75625 | 205.62 |
| 0.7569444444444445 | 191.937 |
| 0.7576388888888889 | 173.709 |
| 0.7583333333333333 | 173.709 |
| 0.7590277777777777 | 164.605 |
| 0.7597222222222223 | 173.709 |
| 0.7604166666666666 | 173.709 |
| 0.7611111111111111 | 164.605 |
| 0.7618055555555556 | 169.156 |
| 0.7625000000000001 | 160.056 |
| 0.7631944444444444 | 146.423 |
| 0.7638888888888888 | 137.347 |
| 0.7645833333333334 | 137.347 |
| 0.7652777777777778 | 141.884 |
| 0.7659722222222222 | 132.814 |
| 0.7666666666666666 | 132.814 |
| 0.7673611111111112 | 128.284 |
| 0.7680555555555556 | 123.758 |
| 0.7687499999999999 | 119.235 |
| 0.7694444444444444 | 114.716 |
| 0.7701388888888889 | 119.235 |
| 0.7708333333333334 | 128.284 |
| 0.7715277777777777 | 137.347 |
| 0.7722222222222223 | 141.884 |
| 0.7729166666666667 | 146.423 |
| 0.7736111111111111 | 155.509 |
| 0.7743055555555555 | 160.056 |
| 0.775 | 160.056 |
| 0.7756944444444445 | 155.509 |
| 0.7763888888888889 | 150.964 |
| 0.7770833333333332 | 137.347 |
| 0.7777777777777778 | 123.758 |
| 0.7784722222222222 | 105.69 |
| 0.7791666666666667 | 96.682 |
| 0.779861111111111 | 87.692 |
| 0.7805555555555556 | 78.722 |
| 0.78125 | 74.246 |
| 0.7819444444444444 | 69.775 |
| 0.782638888888889 | 65.31 |
| 0.7833333333333333 | 65.31 |
| 0.7840277777777778 | 65.31 |
| 0.7847222222222222 | 65.31 |
| 0.7854166666666668 | 65.31 |
| 0.7861111111111111 | 69.775 |
| 0.7868055555555555 | 69.775 |
| 0.7875 | 74.246 |
| 0.7881944444444445 | 74.246 |
| 0.7888888888888889 | 74.246 |
| 0.7895833333333333 | 78.722 |
| 0.7902777777777777 | 83.205 |
| 0.7909722222222223 | 87.692 |
| 0.7916666666666666 | 87.692 |
| 0.7923611111111111 | 87.692 |
| 0.7930555555555556 | 87.692 |
| 0.7937500000000001 | 87.692 |
| 0.7944444444444444 | 83.205 |
| 0.7951388888888888 | 83.205 |
| 0.7958333333333334 | 78.722 |
| 0.7965277777777778 | 74.246 |
| 0.7972222222222222 | 69.775 |
| 0.7979166666666666 | 69.775 |
| 0.7986111111111112 | 69.775 |
| 0.7993055555555556 | 69.775 |
| 0.7999999999999999 | 69.775 |
| 0.8006944444444444 | 65.31 |
| 0.8013888888888889 | 60.85 |
| 0.8020833333333334 | 56.398 |
| 0.8027777777777777 | 56.398 |
| 0.8034722222222223 | 51.951 |
| 0.8041666666666667 | 51.951 |
| 0.8048611111111111 | 51.951 |
| 0.8055555555555555 | 51.951 |
| 0.80625 | 51.951 |
| 0.8069444444444445 | 47.511 |
| 0.8076388888888889 | 47.511 |
| 0.8083333333333332 | 47.511 |
| 0.8090277777777778 | 43.079 |
| 0.8097222222222222 | 43.079 |
| 0.8104166666666667 | 43.079 |
| 0.811111111111111 | 38.653 |
| 0.8118055555555556 | 38.653 |
| 0.8125 | 38.653 |
| 0.8131944444444444 | 34.234 |
| 0.813888888888889 | 34.234 |
| 0.8145833333333333 | 29.823 |
| 0.8152777777777778 | 29.823 |
| 0.8159722222222222 | 29.823 |
| 0.8166666666666668 | 25.419 |
| 0.8173611111111111 | 25.419 |
| 0.8180555555555555 | 25.419 |
| 0.81875 | 21.024 |
| 0.8194444444444445 | 21.024 |
| 0.8201388888888889 | 21.024 |
| 0.8208333333333333 | 21.024 |
| 0.8215277777777777 | 21.024 |
| 0.8222222222222223 | 21.024 |
| 0.8229166666666666 | 21.024 |
| 0.8236111111111111 | 21.024 |
| 0.8243055555555556 | 16.636 |
| 0.8250000000000001 | 16.636 |
| 0.8256944444444444 | 16.636 |
| 0.8263888888888888 | 16.636 |
| 0.8270833333333334 | 16.636 |
| 0.8277777777777778 | 12.257 |
| 0.8284722222222222 | 12.257 |
| 0.8291666666666666 | 12.257 |
| 0.8298611111111112 | 12.257 |
| 0.8305555555555556 | 12.257 |
| 0.8312499999999999 | 12.257 |
| 0.8319444444444444 | 12.257 |
| 0.8326388888888889 | 12.257 |
| 0.8333333333333334 | 12.257 |
| 0.8340277777777777 | 12.257 |
| 0.8347222222222223 | 12.257 |
| 0.8354166666666667 | 12.257 |
| 0.8361111111111111 | 12.257 |
| 0.8368055555555555 | 12.257 |
| 0.8375 | 12.257 |
| 0.8381944444444445 | 12.257 |
| 0.8388888888888889 | 12.257 |
| 0.8395833333333332 | 12.257 |
| 0.8402777777777778 | 12.257 |
| 0.8409722222222222 | 12.257 |
| 0.8416666666666667 | 12.257 |
| 0.842361111111111 | 12.257 |
| 0.8430555555555556 | 7.887 |
| 0.84375 | 7.887 |
| 0.8444444444444444 | 7.887 |
| 0.845138888888889 | 7.887 |
| 0.8458333333333333 | 7.887 |
| 0.8465277777777778 | 7.887 |
| 0.8472222222222222 | 3.525 |
| 0.8479166666666668 | 3.525 |
| 0.8486111111111111 | 3.525 |
| 0.8493055555555555 | 3.525 |
| 0.85 | 3.525 |
| 0.8506944444444445 | 3.525 |
| 0.8513888888888889 | 3.525 |
| 0.8520833333333333 | 3.525 |
| 0.8527777777777777 | 3.525 |
| 0.8534722222222223 | 0 |
| 0.8541666666666666 | 0 |
| 0.8548611111111111 | 0 |
| 0.8555555555555556 | 0 |
| 0.8562500000000001 | 0 |
| 0.8569444444444444 | 0 |
| 0.8576388888888888 | 0 |
| 0.8583333333333334 | 0 |
| 0.8590277777777778 | 0 |
| 0.8597222222222222 | 0 |
| 0.8604166666666666 | 0 |
| 0.8611111111111112 | 0 |
| 0.8618055555555556 | 0 |
| 0.8624999999999999 | 0 |
| 0.8631944444444444 | 0 |
| 0.8638888888888889 | 0 |
| 0.8645833333333334 | 0 |
| 0.8652777777777777 | 0 |
| 0.8659722222222223 | 0 |
| 0.8666666666666667 | 0 |
| 0.8673611111111111 | 0 |
| 0.8680555555555555 | 0 |
| 0.86875 | 0 |
| 0.8694444444444445 | 0 |
| 0.8701388888888889 | 0 |
| 0.8708333333333332 | 0 |
| 0.8715277777777778 | 0 |
| 0.8722222222222222 | 0 |
| 0.8729166666666667 | 0 |
| 0.873611111111111 | 0 |
| 0.8743055555555556 | 0 |
| 0.875 | 0 |
| 0.8756944444444444 | 0 |
| 0.876388888888889 | 0 |
| 0.8770833333333333 | 0 |
| 0.8777777777777778 | 0 |
| 0.8784722222222222 | 0 |
| 0.8791666666666668 | 0 |
| 0.8798611111111111 | 0 |
| 0.8805555555555555 | 0 |
| 0.88125 | 0 |
| 0.8819444444444445 | 0 |
| 0.8826388888888889 | 0 |
| 0.8833333333333333 | 0 |
| 0.8840277777777777 | 0 |
| 0.8847222222222223 | 0 |
| 0.8854166666666666 | 0 |
| 0.8861111111111111 | 0 |
| 0.8868055555555556 | 0 |
| 0.8875000000000001 | 0 |
| 0.8881944444444444 | 0 |
| 0.8888888888888888 | 0 |
| 0.8895833333333334 | 0 |
| 0.8902777777777778 | 0 |
| 0.8909722222222222 | 0 |
| 0.8916666666666666 | 0 |
| 0.8923611111111112 | 0 |
| 0.8930555555555556 | 0 |
| 0.8937499999999999 | 0 |
| 0.8944444444444444 | 0 |
| 0.8951388888888889 | 0 |
| 0.8958333333333334 | 0 |
| 0.8965277777777777 | 0 |
| 0.8972222222222223 | 0 |
| 0.8979166666666667 | 0 |
| 0.8986111111111111 | 0 |
| 0.8993055555555555 | 0 |
| 0.9 | 0 |
| 0.9006944444444445 | 0 |
| 0.9013888888888889 | 0 |
| 0.9020833333333332 | 0 |
| 0.9027777777777778 | 0 |
| 0.9034722222222222 | 0 |
| 0.9041666666666667 | 0 |
| 0.904861111111111 | 0 |
| 0.9055555555555556 | 0 |
| 0.90625 | 0 |
| 0.9069444444444444 | 0 |
| 0.907638888888889 | 0 |
| 0.9083333333333333 | 0 |
| 0.9090277777777778 | 0 |
| 0.9097222222222222 | 0 |
| 0.9104166666666668 | 0 |
| 0.9111111111111111 | 0 |
| 0.9118055555555555 | 0 |
| 0.9125 | 0 |
| 0.9131944444444445 | 0 |
| 0.9138888888888889 | 0 |
| 0.9145833333333333 | 0 |
| 0.9152777777777777 | 0 |
| 0.9159722222222223 | 0 |
| 0.9166666666666666 | 0 |
| 0.9173611111111111 | 0 |
| 0.9180555555555556 | 0 |
| 0.9187500000000001 | 0 |
| 0.9194444444444444 | 0 |
| 0.9201388888888888 | 0 |
| 0.9208333333333334 | 0 |
| 0.9215277777777778 | 0 |
| 0.9222222222222222 | 0 |
| 0.9229166666666666 | 0 |
| 0.9236111111111112 | 0 |
| 0.9243055555555556 | 0 |
| 0.9249999999999999 | 0 |
| 0.9256944444444444 | 0 |
| 0.9263888888888889 | 0 |
| 0.9270833333333334 | 0 |
| 0.9277777777777777 | 0 |
| 0.9284722222222223 | 0 |
| 0.9291666666666667 | 0 |
| 0.9298611111111111 | 0 |
| 0.9305555555555555 | 0 |
| 0.93125 | 0 |
| 0.9319444444444445 | 0 |
| 0.9326388888888889 | 0 |
| 0.9333333333333332 | 0 |
| 0.9340277777777778 | 0 |
| 0.9347222222222222 | 0 |
| 0.9354166666666667 | 0 |
| 0.936111111111111 | 0 |
| 0.9368055555555556 | 0 |
| 0.9375 | 0 |
| 0.9381944444444444 | 0 |
| 0.938888888888889 | 0 |
| 0.9395833333333333 | 0 |
| 0.9402777777777778 | 0 |
| 0.9409722222222222 | 0 |
| 0.9416666666666668 | 0 |
| 0.9423611111111111 | 0 |
| 0.9430555555555555 | 0 |
| 0.94375 | 0 |
| 0.9444444444444445 | 0 |
| 0.9451388888888889 | 0 |
| 0.9458333333333333 | 0 |
| 0.9465277777777777 | 0 |
| 0.9472222222222223 | 0 |
| 0.9479166666666666 | 0 |
| 0.9486111111111111 | 0 |
| 0.9493055555555556 | 0 |
| 0.9500000000000001 | 0 |
| 0.9506944444444444 | 0 |
| 0.9513888888888888 | 0 |
| 0.9520833333333334 | 0 |
| 0.9527777777777778 | 0 |
| 0.9534722222222222 | 0 |
| 0.9541666666666666 | 0 |
| 0.9548611111111112 | 0 |
| 0.9555555555555556 | 0 |
| 0.9562499999999999 | 0 |
| 0.9569444444444444 | 0 |
| 0.9576388888888889 | 0 |
| 0.9583333333333334 | 0 |
| 0.9590277777777777 | 0 |
| 0.9597222222222223 | 0 |
| 0.9604166666666667 | 0 |
| 0.9611111111111111 | 0 |
| 0.9618055555555555 | 0 |
| 0.9625 | 0 |
| 0.9631944444444445 | 0 |
| 0.9638888888888889 | 0 |
| 0.9645833333333332 | 0 |
| 0.9652777777777778 | 0 |
| 0.9659722222222222 | 0 |
| 0.9666666666666667 | 0 |
| 0.967361111111111 | 0 |
| 0.9680555555555556 | 0 |
| 0.96875 | 0 |
| 0.9694444444444444 | 0 |
| 0.970138888888889 | 0 |
| 0.9708333333333333 | 0 |
| 0.9715277777777778 | 0 |
| 0.9722222222222222 | 0 |
| 0.9729166666666668 | 0 |
| 0.9736111111111111 | 0 |
| 0.9743055555555555 | 0 |
| 0.975 | 0 |
| 0.9756944444444445 | 0 |
| 0.9763888888888889 | 0 |
| 0.9770833333333333 | 0 |
| 0.9777777777777777 | 0 |
| 0.9784722222222223 | 0 |
| 0.9791666666666666 | 0 |
| 0.9798611111111111 | 0 |
| 0.9805555555555556 | 0 |
| 0.9812500000000001 | 0 |
| 0.9819444444444444 | 0 |
| 0.9826388888888888 | 0 |
| 0.9833333333333334 | 0 |
| 0.9840277777777778 | 0 |
| 0.9847222222222222 | 0 |
| 0.9854166666666666 | 0 |
| 0.9861111111111112 | 0 |
| 0.9868055555555556 | 0 |
| 0.9874999999999999 | 0 |
| 0.9881944444444444 | 0 |
| 0.9888888888888889 | 0 |
| 0.9895833333333334 | 0 |
| 0.9902777777777777 | 0 |
| 0.9909722222222223 | 0 |
| 0.9916666666666667 | 0 |
| 0.9923611111111111 | 0 |
| 0.9930555555555555 | 0 |
| 0.99375 | 0 |
| 0.9944444444444445 | 0 |
| 0.9951388888888889 | 0 |
| 0.9958333333333332 | 0 |
| 0.9965277777777778 | 0 |
| 0.9972222222222222 | 0 |
| 0.9979166666666667 | 0 |
| 0.998611111111111 | 0 |
| 0.9993055555555556 | 0 |